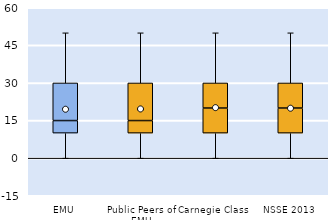
| Category | 25th | 50th | 75th |
|---|---|---|---|
| EMU | 10 | 5 | 15 |
| Public Peers of EMU | 10 | 5 | 15 |
| Carnegie Class | 10 | 10 | 10 |
| NSSE 2013 | 10 | 10 | 10 |